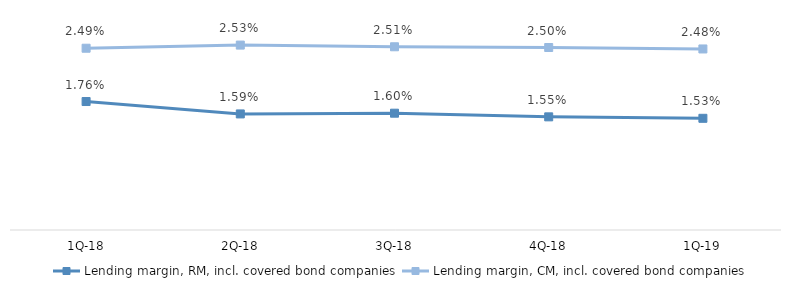
| Category | Lending margin, RM, incl. covered bond companies | Lending margin, CM, incl. covered bond companies |
|---|---|---|
| 1Q-19 | 0.015 | 0.025 |
| 4Q-18 | 0.016 | 0.025 |
| 3Q-18 | 0.016 | 0.025 |
| 2Q-18 | 0.016 | 0.025 |
| 1Q-18 | 0.018 | 0.025 |